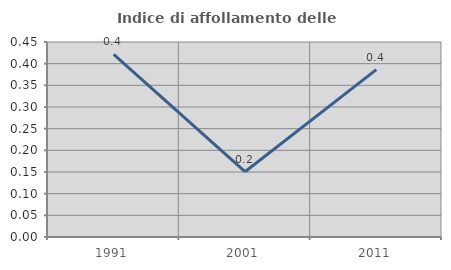
| Category | Indice di affollamento delle abitazioni  |
|---|---|
| 1991.0 | 0.421 |
| 2001.0 | 0.151 |
| 2011.0 | 0.386 |